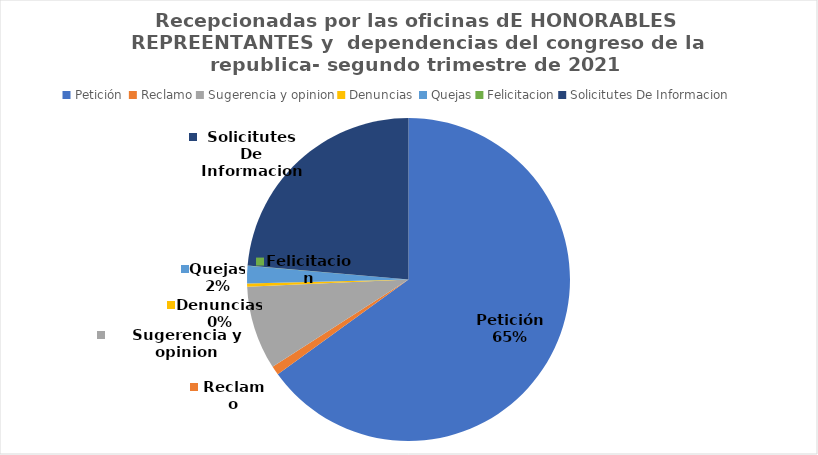
| Category | Series 0 |
|---|---|
| Petición  | 3642 |
| Reclamo | 51 |
| Sugerencia y opinion | 469 |
| Denuncias  | 17 |
| Quejas | 98 |
| Felicitacion | 2 |
| Solicitutes De Informacion | 1323 |